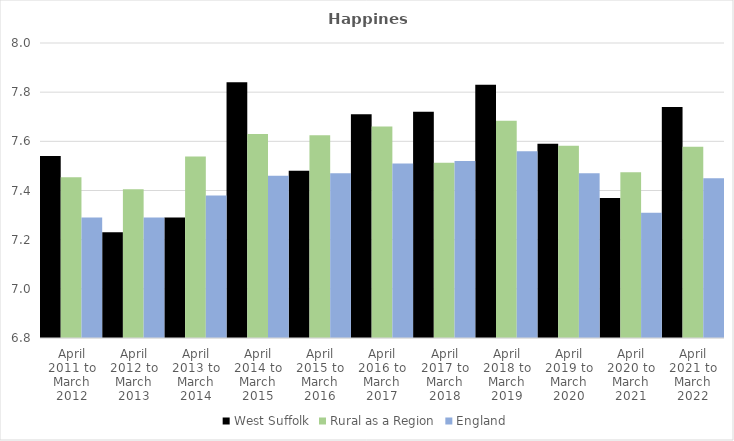
| Category | West Suffolk | Rural as a Region | England |
|---|---|---|---|
| April 2011 to March 2012 | 7.54 | 7.454 | 7.29 |
| April 2012 to March 2013 | 7.23 | 7.406 | 7.29 |
| April 2013 to March 2014 | 7.29 | 7.539 | 7.38 |
| April 2014 to March 2015 | 7.84 | 7.63 | 7.46 |
| April 2015 to March 2016 | 7.48 | 7.625 | 7.47 |
| April 2016 to March 2017 | 7.71 | 7.661 | 7.51 |
| April 2017 to March 2018 | 7.72 | 7.513 | 7.52 |
| April 2018 to March 2019 | 7.83 | 7.684 | 7.56 |
| April 2019 to March 2020 | 7.59 | 7.582 | 7.47 |
| April 2020 to March 2021 | 7.37 | 7.474 | 7.31 |
| April 2021 to March 2022 | 7.74 | 7.577 | 7.45 |